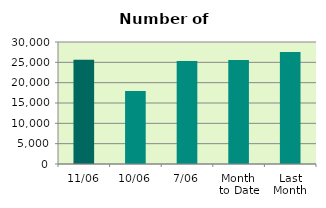
| Category | Series 0 |
|---|---|
| 11/06 | 25636 |
| 10/06 | 17970 |
| 7/06 | 25336 |
| Month 
to Date | 25572.857 |
| Last
Month | 27522.455 |